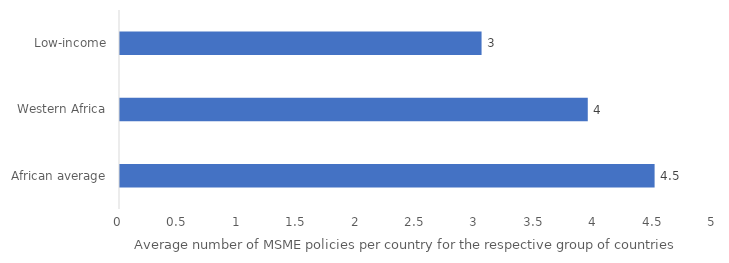
| Category | Series 0 |
|---|---|
| African average | 4.5 |
| Western Africa | 3.938 |
| Low-income | 3.043 |